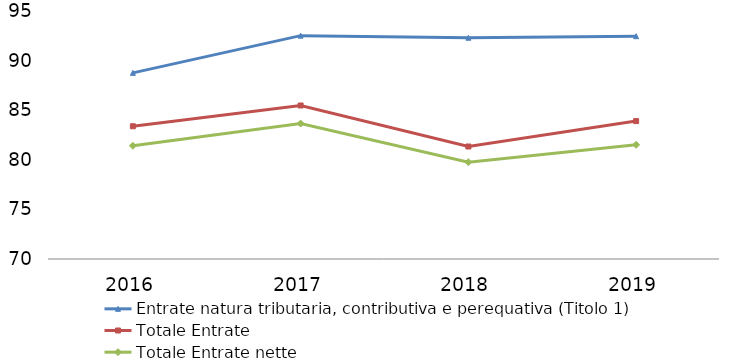
| Category | Entrate natura tributaria, contributiva e perequativa (Titolo 1) | Totale Entrate | Totale Entrate nette |
|---|---|---|---|
| 2016.0 | 88.765 | 83.381 | 81.414 |
| 2017.0 | 92.515 | 85.474 | 83.655 |
| 2018.0 | 92.303 | 81.341 | 79.761 |
| 2019.0 | 92.462 | 83.903 | 81.513 |